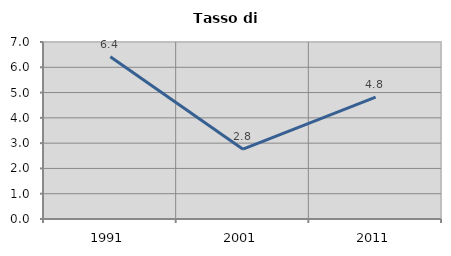
| Category | Tasso di disoccupazione   |
|---|---|
| 1991.0 | 6.419 |
| 2001.0 | 2.76 |
| 2011.0 | 4.821 |